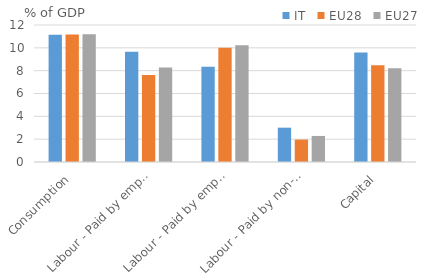
| Category | IT | EU28 | EU27 |
|---|---|---|---|
| Consumption | 11.146 | 11.162 | 11.186 |
| Labour - Paid by employers | 9.662 | 7.618 | 8.281 |
| Labour - Paid by employees | 8.343 | 9.997 | 10.231 |
| Labour - Paid by non-employed | 3.007 | 1.966 | 2.281 |
| Capital | 9.594 | 8.473 | 8.218 |